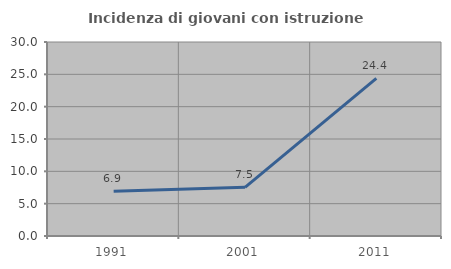
| Category | Incidenza di giovani con istruzione universitaria |
|---|---|
| 1991.0 | 6.912 |
| 2001.0 | 7.527 |
| 2011.0 | 24.382 |